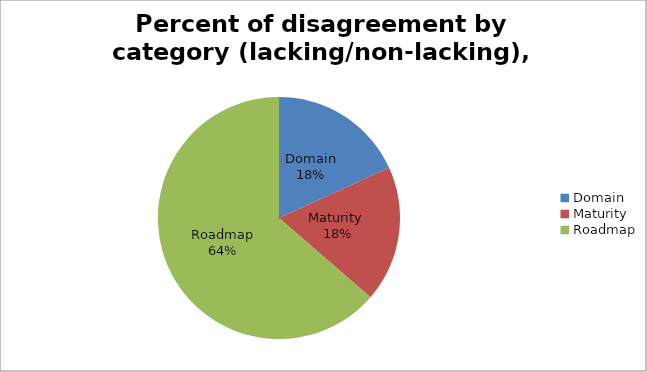
| Category | Percent of disagreement by category (lacking/non-lacking), secondary |
|---|---|
| Domain | 2 |
| Maturity  | 2 |
| Roadmap | 7 |